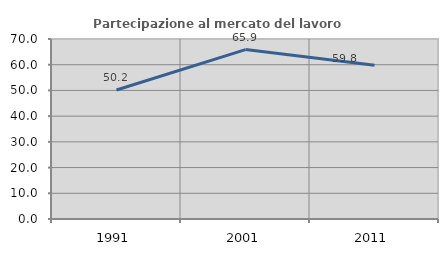
| Category | Partecipazione al mercato del lavoro  femminile |
|---|---|
| 1991.0 | 50.15 |
| 2001.0 | 65.889 |
| 2011.0 | 59.767 |